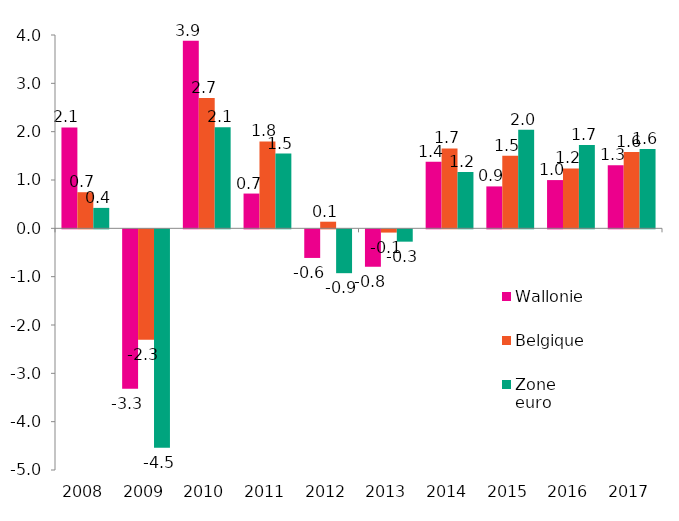
| Category | Wallonie | Belgique | Zone euro |
|---|---|---|---|
| 2008.0 | 2.088 | 0.747 | 0.423 |
| 2009.0 | -3.3 | -2.285 | -4.52 |
| 2010.0 | 3.88 | 2.695 | 2.091 |
| 2011.0 | 0.72 | 1.797 | 1.546 |
| 2012.0 | -0.592 | 0.137 | -0.907 |
| 2013.0 | -0.774 | -0.067 | -0.255 |
| 2014.0 | 1.377 | 1.653 | 1.167 |
| 2015.0 | 0.867 | 1.5 | 2.038 |
| 2016.0 | 0.998 | 1.24 | 1.726 |
| 2017.0 | 1.304 | 1.578 | 1.642 |